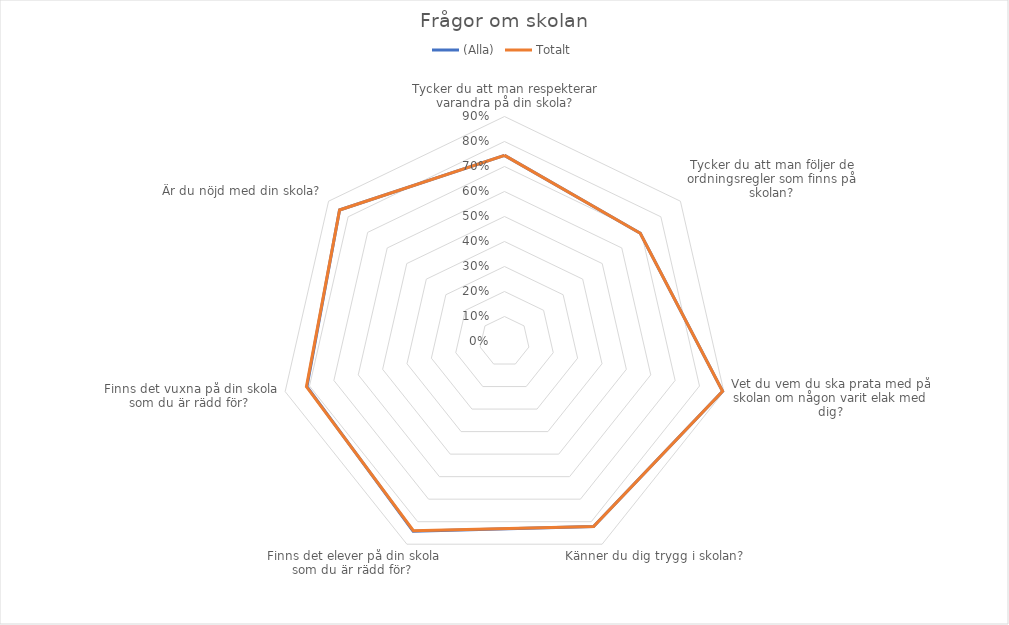
| Category | (Alla) | Totalt |
|---|---|---|
| Tycker du att man respekterar varandra på din skola? | 0.745 | 0.745 |
| Tycker du att man följer de ordningsregler som finns på skolan? | 0.695 | 0.695 |
| Vet du vem du ska prata med på skolan om någon varit elak med dig? | 0.895 | 0.895 |
| Känner du dig trygg i skolan? | 0.821 | 0.821 |
| Finns det elever på din skola som du är rädd för?  | 0.842 | 0.84 |
| Finns det vuxna på din skola som du är rädd för?  | 0.811 | 0.813 |
| Är du nöjd med din skola? | 0.844 | 0.844 |